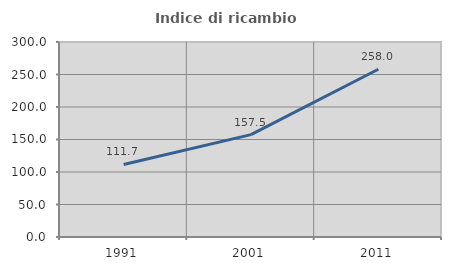
| Category | Indice di ricambio occupazionale  |
|---|---|
| 1991.0 | 111.654 |
| 2001.0 | 157.549 |
| 2011.0 | 258.025 |